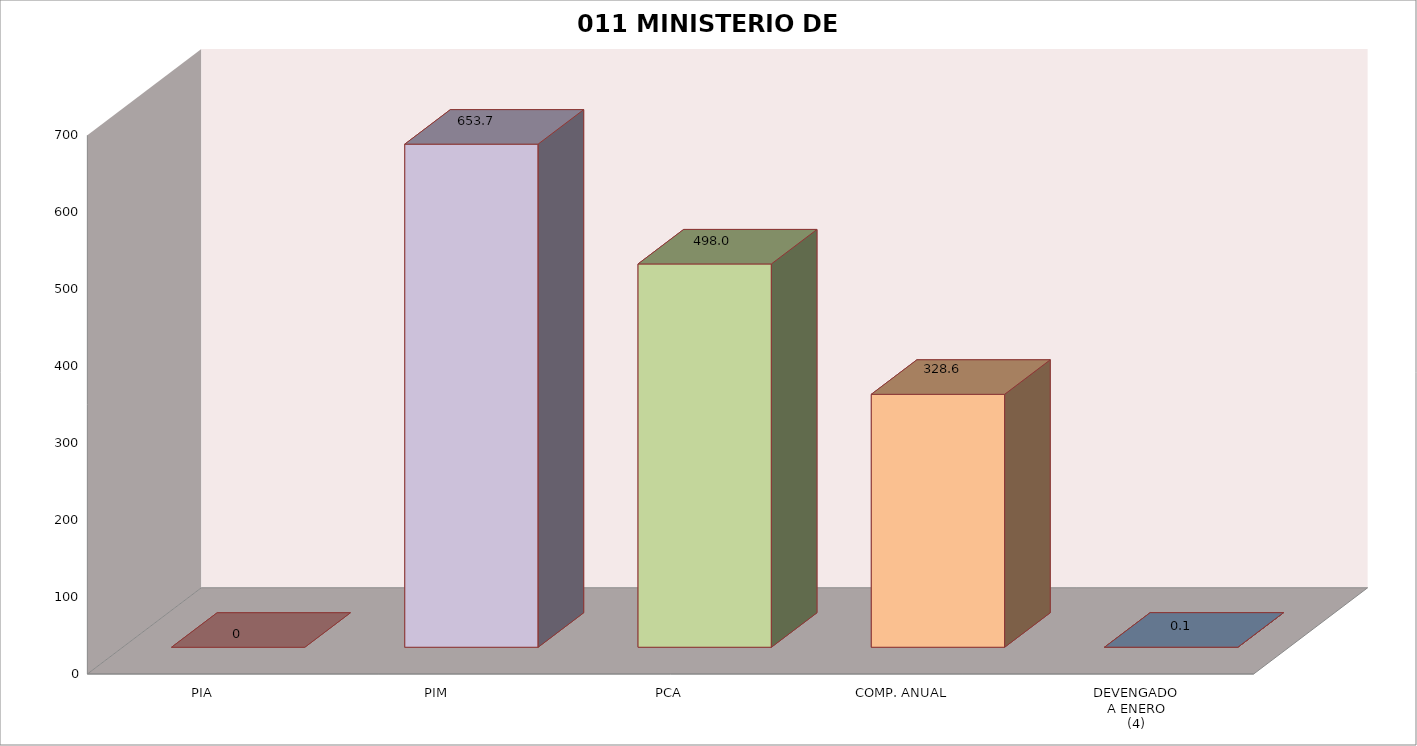
| Category | 011 MINISTERIO DE SALUD |
|---|---|
| PIA | 0 |
| PIM | 653.699 |
| PCA | 498.017 |
| COMP. ANUAL | 328.65 |
| DEVENGADO
A ENERO
(4) | 0.107 |